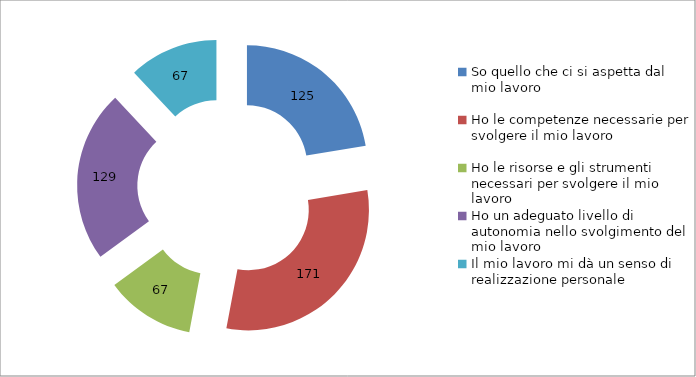
| Category | Series 0 |
|---|---|
| So quello che ci si aspetta dal mio lavoro | 125 |
| Ho le competenze necessarie per svolgere il mio lavoro | 171 |
| Ho le risorse e gli strumenti necessari per svolgere il mio lavoro | 67 |
| Ho un adeguato livello di autonomia nello svolgimento del mio lavoro | 129 |
| Il mio lavoro mi dà un senso di realizzazione personale | 67 |